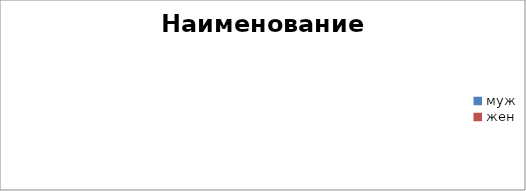
| Category | Наименование точки |
|---|---|
| муж | 0 |
| жен | 0 |